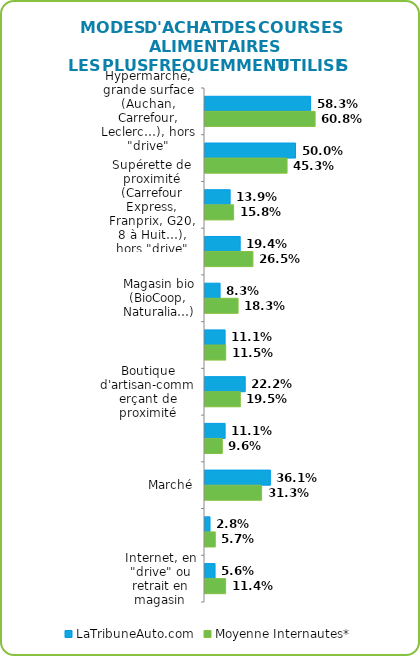
| Category | LaTribuneAuto.com | Moyenne Internautes* |
|---|---|---|
| Hypermarché, grande surface (Auchan, Carrefour, Leclerc…), hors "drive" | 0.583 | 0.608 |
| Supermarché (Intermarché, Monoprix, Super U...), hors "drive" | 0.5 | 0.453 |
| Supérette de proximité (Carrefour Express, Franprix, G20, 8 à Huit…), hors "drive" | 0.139 | 0.158 |
| Magasin de hard discount (Aldi, Leader Price, Lidl...) | 0.194 | 0.265 |
| Magasin bio (BioCoop, Naturalia…) | 0.083 | 0.183 |
| Magasin de surgelés | 0.111 | 0.115 |
| Boutique d'artisan-commerçant de proximité | 0.222 | 0.195 |
| Epicerie de quartier | 0.111 | 0.096 |
| Marché | 0.361 | 0.313 |
| Internet, en livraison à domicile | 0.028 | 0.057 |
| Internet, en "drive" ou retrait en magasin | 0.056 | 0.114 |